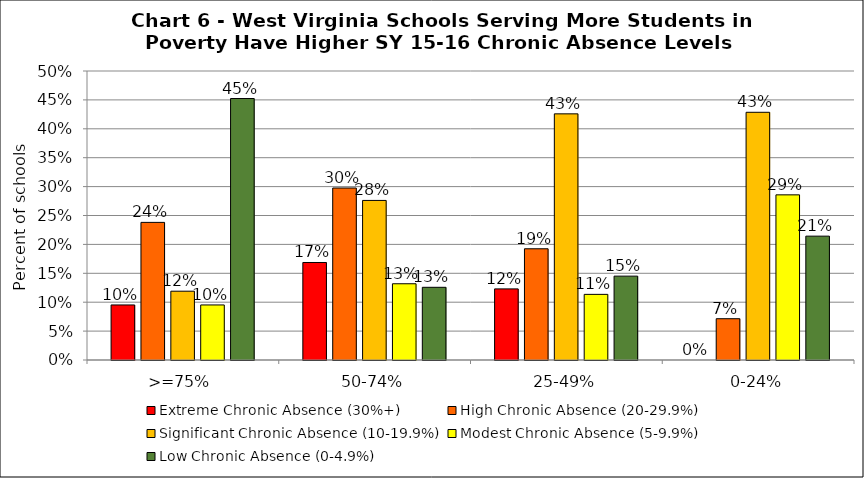
| Category | Extreme Chronic Absence (30%+) | High Chronic Absence (20-29.9%) | Significant Chronic Absence (10-19.9%) | Modest Chronic Absence (5-9.9%) | Low Chronic Absence (0-4.9%) |
|---|---|---|---|---|---|
| 0 | 0.095 | 0.238 | 0.119 | 0.095 | 0.452 |
| 1 | 0.169 | 0.298 | 0.276 | 0.132 | 0.126 |
| 2 | 0.123 | 0.192 | 0.426 | 0.114 | 0.145 |
| 3 | 0 | 0.071 | 0.429 | 0.286 | 0.214 |